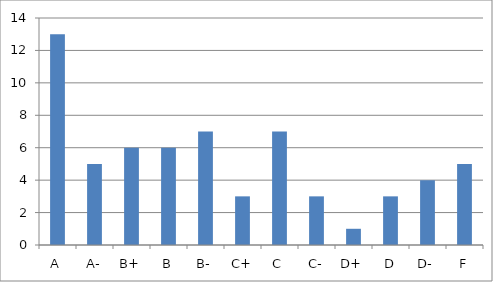
| Category | Series 0 |
|---|---|
| A | 13 |
| A- | 5 |
| B+ | 6 |
| B | 6 |
| B- | 7 |
| C+ | 3 |
| C | 7 |
| C- | 3 |
| D+ | 1 |
| D | 3 |
| D- | 4 |
| F | 5 |